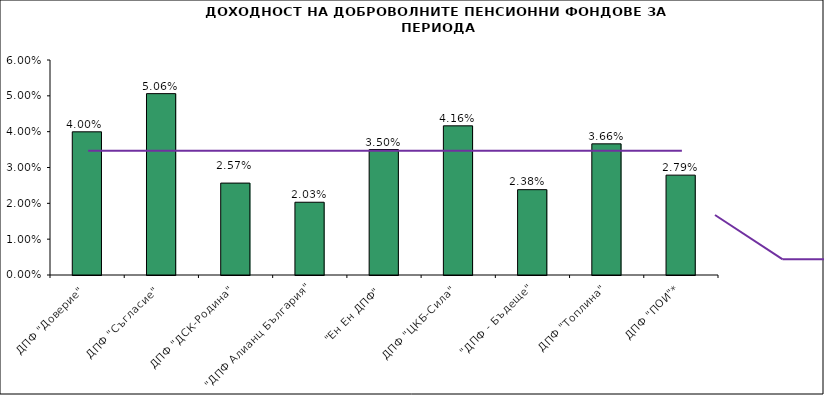
| Category | Series 0 |
|---|---|
| ДПФ "Доверие"  | 0.04 |
| ДПФ "Съгласие"  | 0.051 |
| ДПФ "ДСК-Родина"  | 0.026 |
| "ДПФ Алианц България"  | 0.02 |
| "Ен Ен ДПФ"  | 0.035 |
| ДПФ "ЦКБ-Сила"  | 0.042 |
| "ДПФ - Бъдеще" | 0.024 |
| ДПФ "Топлина" | 0.037 |
| ДПФ "ПОИ"* | 0.028 |